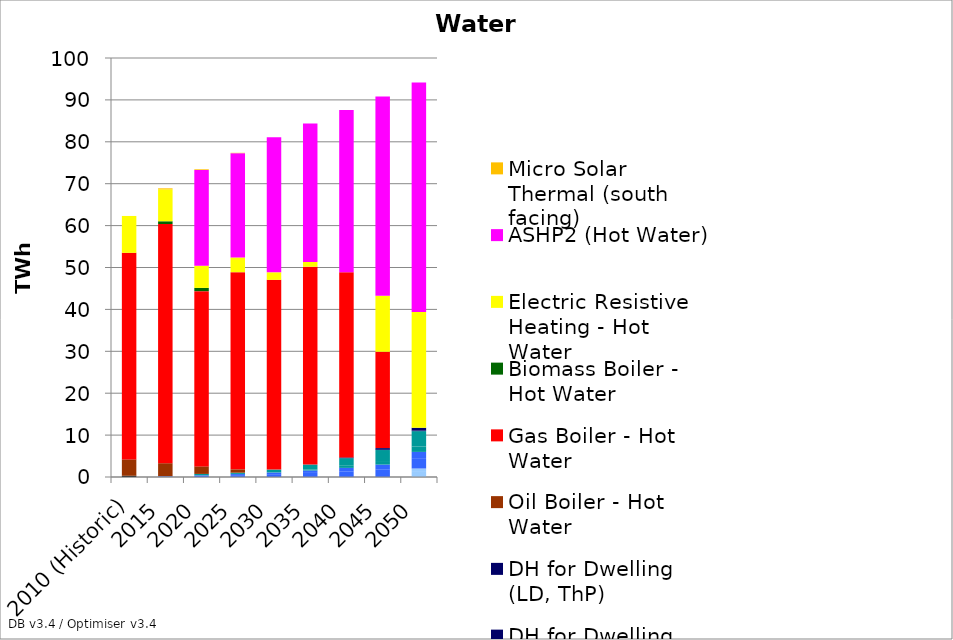
| Category | Solid Fuel Boiler - Hot Water | District Heating (Commercial floorspace) | District Heating (Public floorspace) | DH for Dwelling (HD, ThM) | DH for Dwelling (HD, ThP) | DH for Dwelling (MD, ThM) | DH for Dwelling (MD, ThP) | DH for Dwelling (LD, ThM) | DH for Dwelling (LD, ThP) | Oil Boiler - Hot Water | Gas Boiler - Hot Water | Biomass Boiler - Hot Water | Electric Resistive Heating - Hot Water | ASHP2 (Hot Water) | Micro Solar Thermal (south facing) |
|---|---|---|---|---|---|---|---|---|---|---|---|---|---|---|---|
| 2010 (Historic) | 0.3 | 0 | 0 | 0 | 0 | 0 | 0 | 0 | 0 | 3.9 | 49.3 | 0 | 8.8 | 0 | 0 |
| 2015 | 0 | 0 | 0 | 0.113 | 0.07 | 0 | 0.009 | 0 | 0 | 3.101 | 57.093 | 0.648 | 7.614 | 0 | 0.244 |
| 2020 | 0 | 0 | 0 | 0.257 | 0.149 | 0.037 | 0.292 | 0 | 0 | 1.801 | 41.82 | 0.776 | 5.309 | 22.858 | 0.163 |
| 2025 | 0 | 0 | 0 | 0.441 | 0.261 | 0.037 | 0.292 | 0 | 0 | 0.8 | 47.052 | 0 | 3.506 | 24.898 | 0.081 |
| 2030 | 0 | 0 | 0 | 0.676 | 0.404 | 0.037 | 0.657 | 0 | 0 | 0 | 45.276 | 0 | 1.803 | 32.222 | 0 |
| 2035 | 0 | 0 | 0 | 0.976 | 0.586 | 0.245 | 1.161 | 0 | 0.014 | 0 | 47.206 | 0 | 1.135 | 33.035 | 0 |
| 2040 | 0 | 0 | 0 | 1.359 | 0.818 | 0.51 | 1.804 | 0 | 0.182 | 0 | 44.183 | 0 | 0 | 38.754 | 0 |
| 2045 | 0 | 0 | 0 | 1.848 | 1.114 | 0.849 | 2.626 | 0.06 | 0.395 | 0 | 22.999 | 0 | 13.364 | 47.578 | 0 |
| 2050 | 0 | 1.412 | 0.615 | 2.471 | 1.492 | 1.281 | 3.674 | 0.137 | 0.668 | 0 | 0 | 0 | 27.623 | 54.782 | 0 |